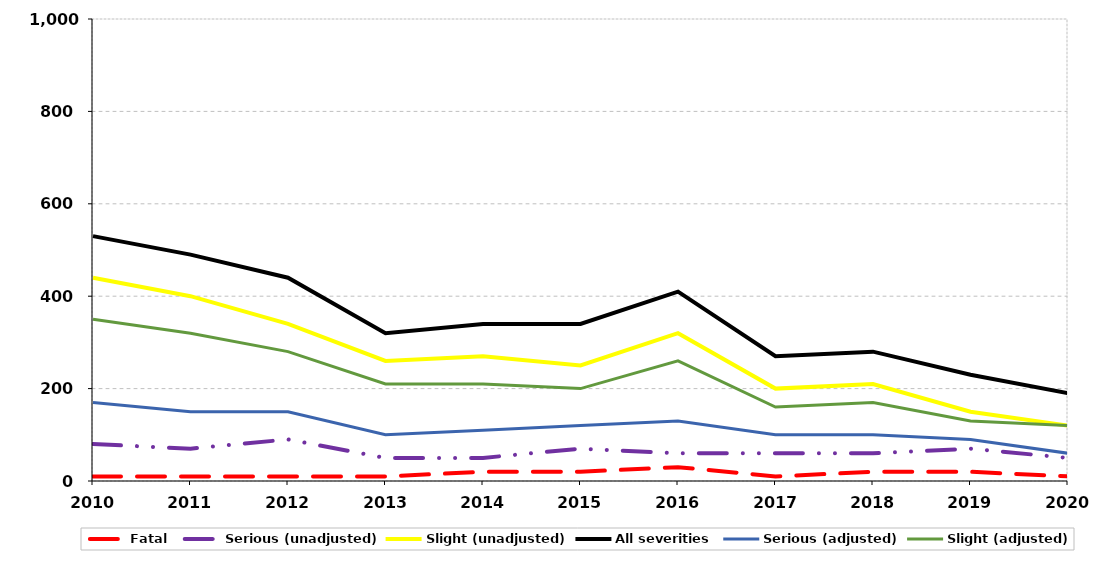
| Category | Fatal | Serious (unadjusted) | Slight (unadjusted) | All severities | Serious (adjusted) | Slight (adjusted) |
|---|---|---|---|---|---|---|
| 2010.0 | 10 | 80 | 440 | 530 | 170 | 350 |
| 2011.0 | 10 | 70 | 400 | 490 | 150 | 320 |
| 2012.0 | 10 | 90 | 340 | 440 | 150 | 280 |
| 2013.0 | 10 | 50 | 260 | 320 | 100 | 210 |
| 2014.0 | 20 | 50 | 270 | 340 | 110 | 210 |
| 2015.0 | 20 | 70 | 250 | 340 | 120 | 200 |
| 2016.0 | 30 | 60 | 320 | 410 | 130 | 260 |
| 2017.0 | 10 | 60 | 200 | 270 | 100 | 160 |
| 2018.0 | 20 | 60 | 210 | 280 | 100 | 170 |
| 2019.0 | 20 | 70 | 150 | 230 | 90 | 130 |
| 2020.0 | 10 | 50 | 120 | 190 | 60 | 120 |